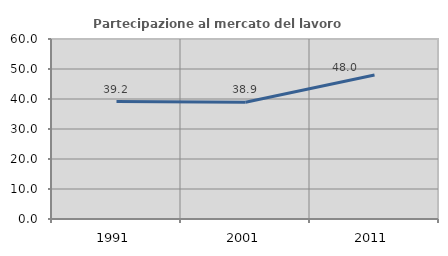
| Category | Partecipazione al mercato del lavoro  femminile |
|---|---|
| 1991.0 | 39.151 |
| 2001.0 | 38.889 |
| 2011.0 | 48.018 |